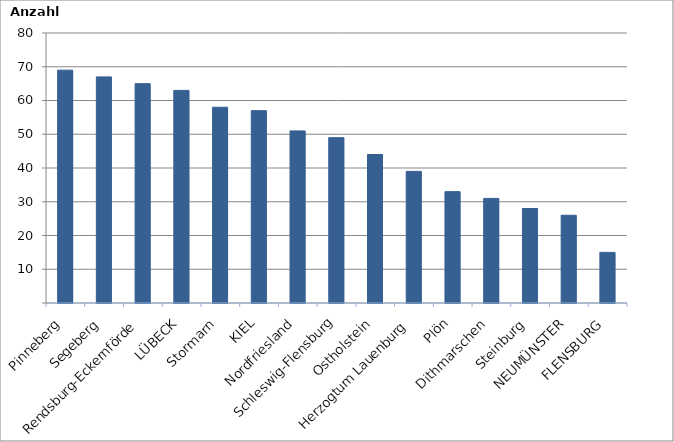
| Category | Series 0 |
|---|---|
| Pinneberg | 69 |
| Segeberg | 67 |
| Rendsburg-Eckernförde | 65 |
| LÜBECK | 63 |
| Stormarn | 58 |
| KIEL | 57 |
| Nordfriesland | 51 |
| Schleswig-Flensburg | 49 |
| Ostholstein | 44 |
| Herzogtum Lauenburg | 39 |
| Plön | 33 |
| Dithmarschen | 31 |
| Steinburg | 28 |
| NEUMÜNSTER | 26 |
| FLENSBURG | 15 |